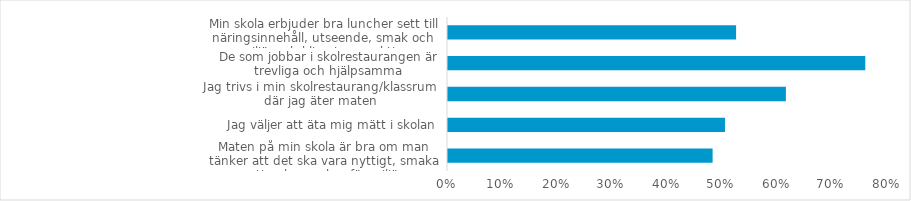
| Category | (Alla) |
|---|---|
| Maten på min skola är bra om man tänker att det ska vara nyttigt, smaka gott och vara bra för miljön | 0.481 |
| Jag väljer att äta mig mätt i skolan | 0.504 |
| Jag trivs i min skolrestaurang/klassrum där jag äter maten | 0.614 |
| De som jobbar i skolrestaurangen är trevliga och hjälpsamma | 0.759 |
| Min skola erbjuder bra luncher sett till näringsinnehåll, utseende, smak och miljö- och klimatperspektiv. | 0.524 |